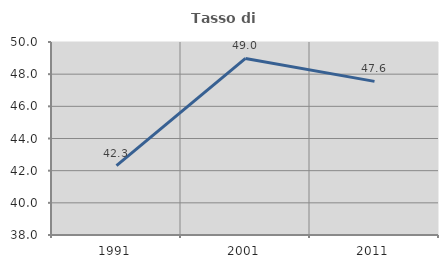
| Category | Tasso di occupazione   |
|---|---|
| 1991.0 | 42.308 |
| 2001.0 | 48.98 |
| 2011.0 | 47.552 |